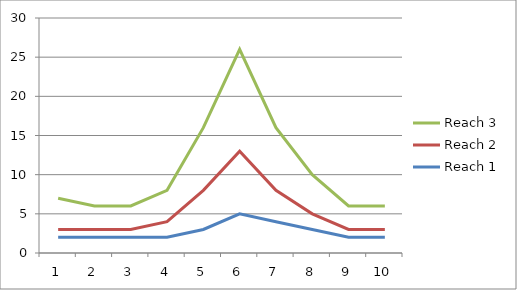
| Category | Reach 1 | Reach 2 | Reach 3 |
|---|---|---|---|
| 0 | 2 | 1 | 4 |
| 1 | 2 | 1 | 3 |
| 2 | 2 | 1 | 3 |
| 3 | 2 | 2 | 4 |
| 4 | 3 | 5 | 8 |
| 5 | 5 | 8 | 13 |
| 6 | 4 | 4 | 8 |
| 7 | 3 | 2 | 5 |
| 8 | 2 | 1 | 3 |
| 9 | 2 | 1 | 3 |